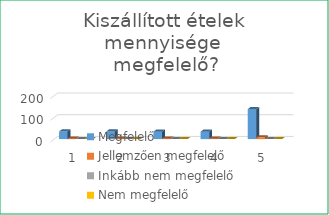
| Category | Megfelelő | Jellemzően megfelelő | Inkább nem megfelelő  | Nem megfelelő |
|---|---|---|---|---|
| 0 | 35 | 2 | 0 | 0 |
| 1 | 35 | 2 | 0 | 0 |
| 2 | 34 | 2 | 0 | 0 |
| 3 | 34 | 2 | 0 | 0 |
| 4 | 138 | 8 | 0 | 0 |